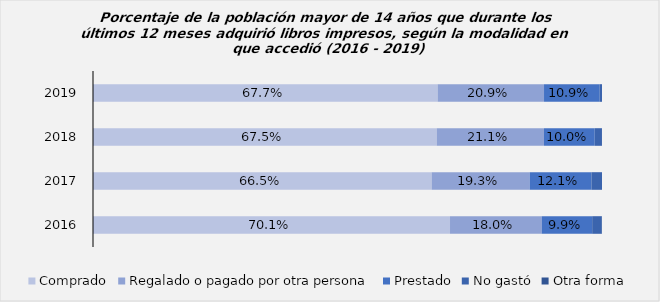
| Category | Comprado | Regalado o pagado por otra persona | Prestado | No gastó | Otra forma |
|---|---|---|---|---|---|
| 2019.0 | 0.677 | 0.209 | 0.109 | 0.004 | 0 |
| 2018.0 | 0.675 | 0.211 | 0.1 | 0.014 | 0 |
| 2017.0 | 0.665 | 0.193 | 0.121 | 0.021 | 0 |
| 2016.0 | 0.701 | 0.18 | 0.099 | 0.019 | 0 |